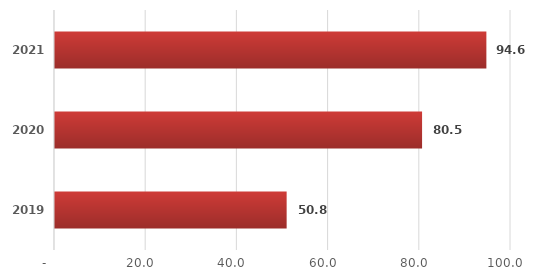
| Category | Series 0 |
|---|---|
| 2019.0 | 50.8 |
| 2020.0 | 80.5 |
| 2021.0 | 94.6 |